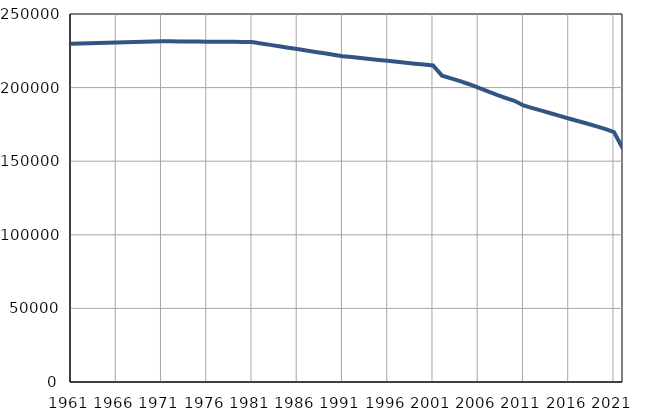
| Category | Број
становника |
|---|---|
| 1961.0 | 229812 |
| 1962.0 | 229979 |
| 1963.0 | 230147 |
| 1964.0 | 230314 |
| 1965.0 | 230482 |
| 1966.0 | 230649 |
| 1967.0 | 230816 |
| 1968.0 | 230984 |
| 1969.0 | 231151 |
| 1970.0 | 231319 |
| 1971.0 | 231486 |
| 1972.0 | 231434 |
| 1973.0 | 231381 |
| 1974.0 | 231329 |
| 1975.0 | 231276 |
| 1976.0 | 231224 |
| 1977.0 | 231172 |
| 1978.0 | 231119 |
| 1979.0 | 231067 |
| 1980.0 | 231014 |
| 1981.0 | 230962 |
| 1982.0 | 230001 |
| 1983.0 | 229040 |
| 1984.0 | 228079 |
| 1985.0 | 227118 |
| 1986.0 | 226158 |
| 1987.0 | 225197 |
| 1988.0 | 224236 |
| 1989.0 | 223275 |
| 1990.0 | 222314 |
| 1991.0 | 221353 |
| 1992.0 | 220718 |
| 1993.0 | 220083 |
| 1994.0 | 219447 |
| 1995.0 | 218812 |
| 1996.0 | 218177 |
| 1997.0 | 217542 |
| 1998.0 | 216907 |
| 1999.0 | 216271 |
| 2000.0 | 215636 |
| 2001.0 | 215001 |
| 2002.0 | 208103 |
| 2003.0 | 206278 |
| 2004.0 | 204382 |
| 2005.0 | 202286 |
| 2006.0 | 199999 |
| 2007.0 | 197585 |
| 2008.0 | 195190 |
| 2009.0 | 193067 |
| 2010.0 | 191031 |
| 2011.0 | 187860 |
| 2012.0 | 186013 |
| 2013.0 | 184311 |
| 2014.0 | 182555 |
| 2015.0 | 180772 |
| 2016.0 | 178995 |
| 2017.0 | 177308 |
| 2018.0 | 175623 |
| 2019.0 | 173873 |
| 2020.0 | 171988 |
| 2021.0 | 169757 |
| 2022.0 | 158367 |